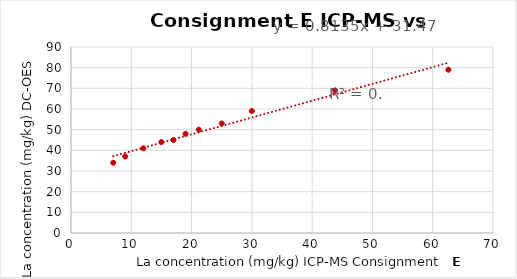
| Category | DC-OES La (mg/kg) |
|---|---|
| 7.0 | 34 |
| 9.0 | 37 |
| 12.0 | 41 |
| 15.0 | 44 |
| 17.0 | 45 |
| 19.0 | 48 |
| 21.2 | 50 |
| 25.0 | 53 |
| 30.0 | 59 |
| 43.8 | 69 |
| 62.6 | 79 |